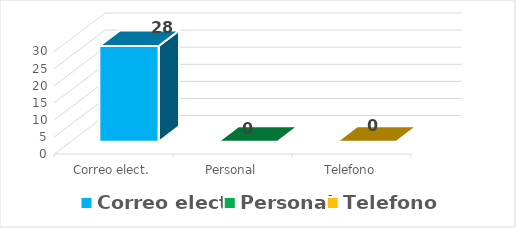
| Category | Series 0 |
|---|---|
| Correo elect. | 28 |
| Personal | 0 |
| Telefono | 0 |